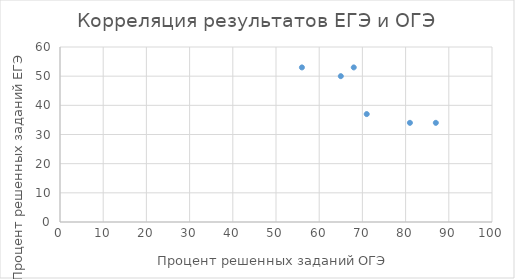
| Category | Процент решённых заданий ЕГЭ |
|---|---|
| 81.0 | 34 |
| 87.0 | 34 |
| 71.0 | 37 |
| 65.0 | 50 |
| 68.0 | 53 |
| 56.0 | 53 |